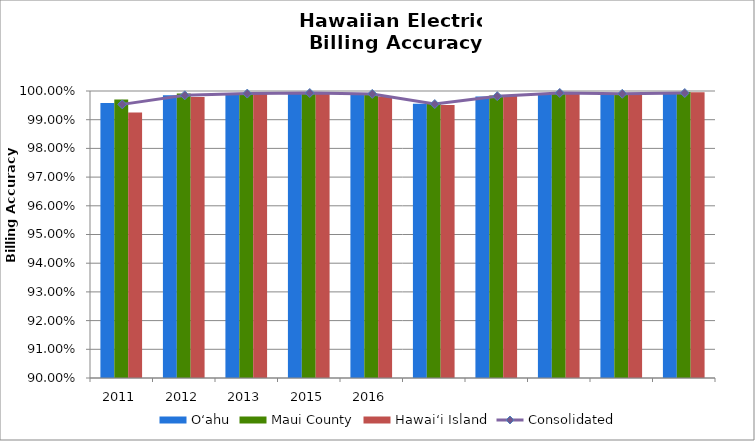
| Category | O‘ahu | Maui County | Hawai‘i Island |
|---|---|---|---|
| 2011.0 | 0.996 | 0.997 | 0.992 |
| 2012.0 | 0.998 | 0.999 | 0.998 |
| 2013.0 | 0.999 | 0.999 | 0.999 |
| 2015.0 | 0.999 | 0.999 | 0.999 |
| 2016.0 | 0.999 | 0.999 | 0.998 |